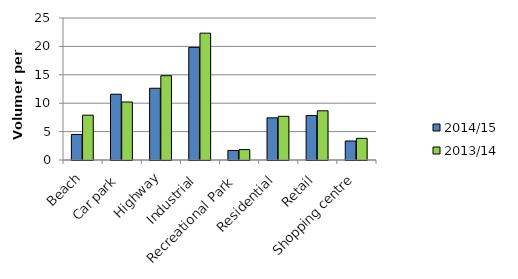
| Category | 2014/15 | 2013/14 |
|---|---|---|
| Beach | 4.5 | 7.89 |
| Car park | 11.58 | 10.21 |
| Highway | 12.63 | 14.84 |
| Industrial | 19.83 | 22.33 |
| Recreational Park | 1.68 | 1.83 |
| Residential | 7.42 | 7.69 |
| Retail | 7.84 | 8.66 |
| Shopping centre | 3.35 | 3.81 |